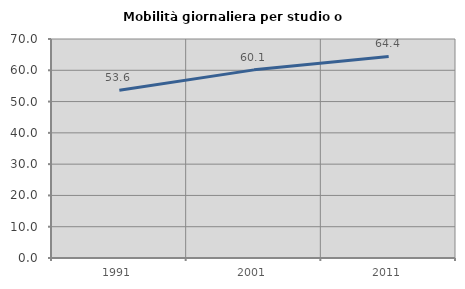
| Category | Mobilità giornaliera per studio o lavoro |
|---|---|
| 1991.0 | 53.602 |
| 2001.0 | 60.135 |
| 2011.0 | 64.444 |